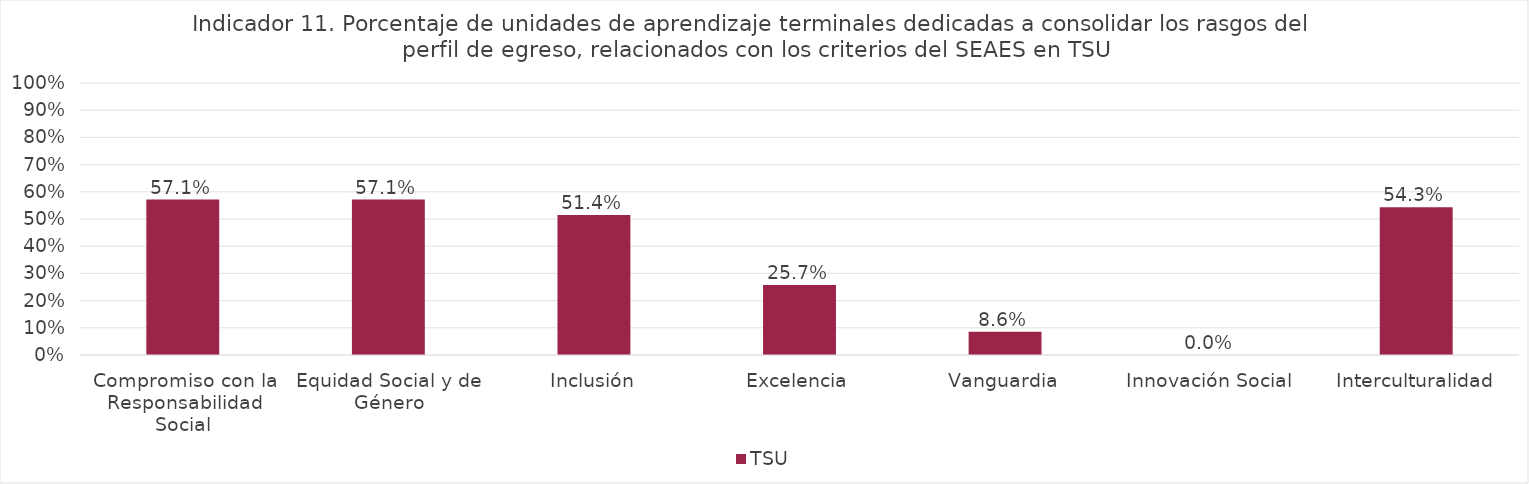
| Category | TSU |
|---|---|
| Compromiso con la Responsabilidad Social | 0.571 |
| Equidad Social y de Género | 0.571 |
| Inclusión | 0.514 |
| Excelencia | 0.257 |
| Vanguardia | 0.086 |
| Innovación Social | 0 |
| Interculturalidad | 0.543 |